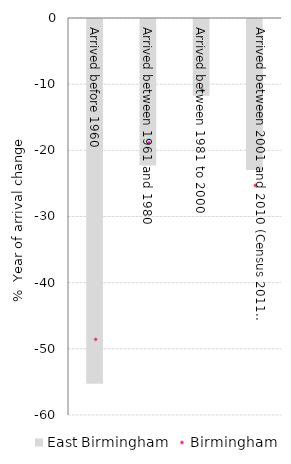
| Category | East Birmingham |
|---|---|
| Arrived before 1960 | -55.129 |
| Arrived between 1961 and 1980 | -22.128 |
| Arrived between 1981 to 2000 | -11.597 |
| Arrived between 2001 and 2010 (Census 2011: 2001 to 2011) | -22.816 |